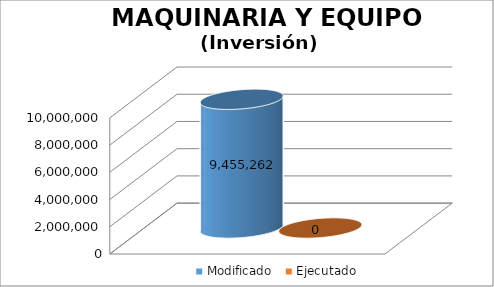
| Category | Modificado | Ejecutado |
|---|---|---|
| 0 | 9455262 | 0 |